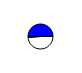
| Category | Series 0 |
|---|---|
| 0 | 21101 |
| 1 | 22113 |